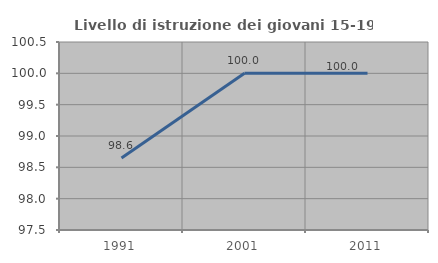
| Category | Livello di istruzione dei giovani 15-19 anni |
|---|---|
| 1991.0 | 98.649 |
| 2001.0 | 100 |
| 2011.0 | 100 |